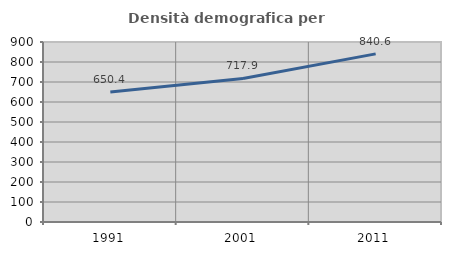
| Category | Densità demografica |
|---|---|
| 1991.0 | 650.371 |
| 2001.0 | 717.949 |
| 2011.0 | 840.642 |